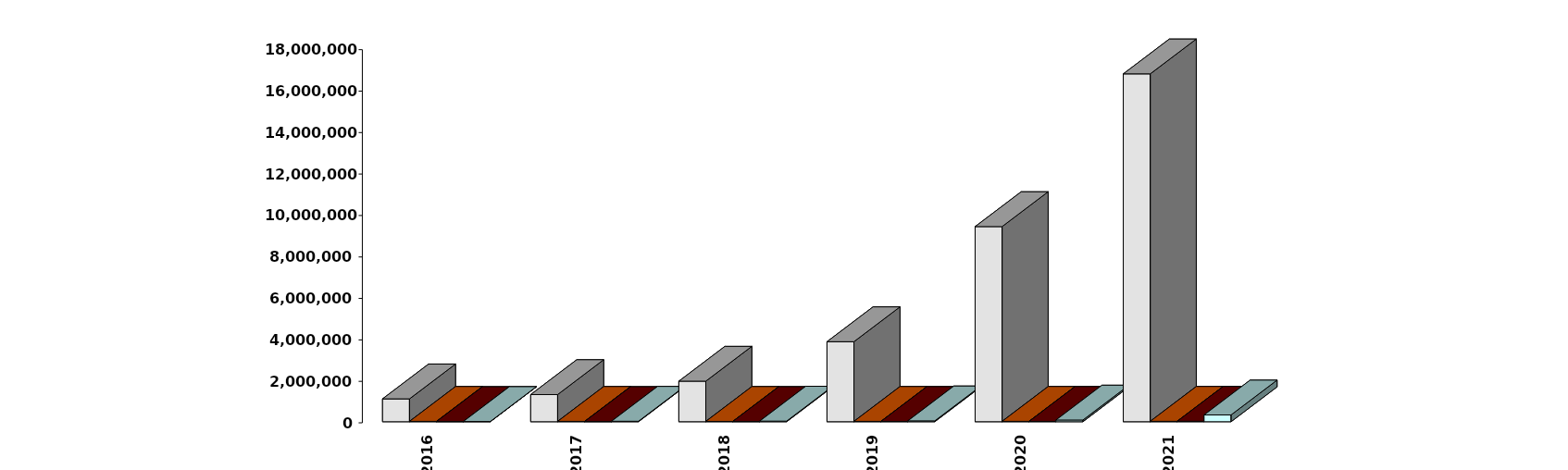
| Category | Физические лица | Юридические лица | Иностранные лица | Клиенты, передавшие свои средства в ДУ |
|---|---|---|---|---|
| 2016-12-31 | 1102966 | 18622 | 9215 | 10694 |
| 2017-12-31 | 1310296 | 17766 | 10211 | 22564 |
| 2018-12-31 | 1955118 | 16631 | 11453 | 29262 |
| 2019-12-31 | 3859911 | 17695 | 14011 | 41535 |
| 2020-12-31 | 9412672 | 19074 | 17041 | 82193 |
| 2021-12-31 | 16779069 | 20446 | 23517 | 327432 |